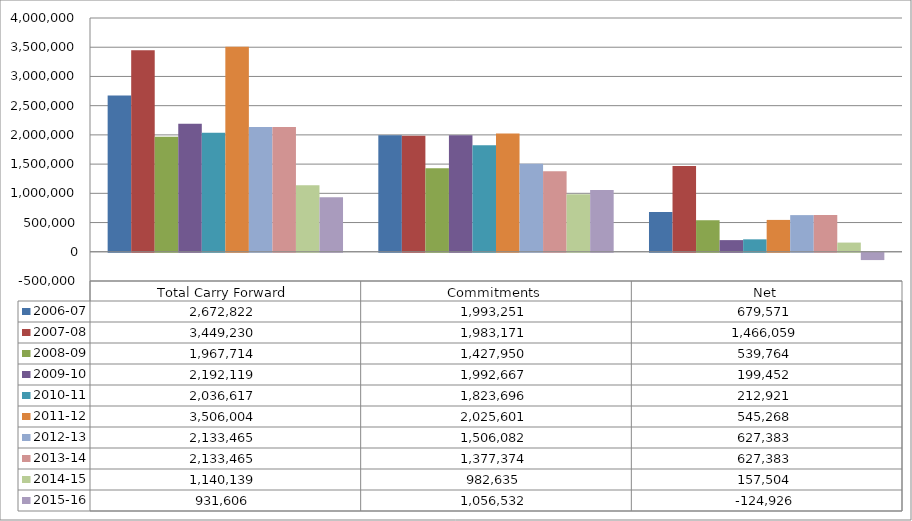
| Category | 2006-07 | 2007-08 | 2008-09 | 2009-10 | 2010-11 | 2011-12 | 2012-13 | 2013-14 | 2014-15 | 2015-16 |
|---|---|---|---|---|---|---|---|---|---|---|
| Total Carry Forward | 2672821.99 | 3449230 | 1967714.35 | 2192119.03 | 2036617 | 3506004 | 2133465 | 2133465 | 1140139.02 | 931606 |
| Commitments | 1993251 | 1983171 | 1427950 | 1992667 | 1823696 | 2025601 | 1506082 | 1377374 | 982635 | 1056532 |
| Net | 679570.99 | 1466059 | 539764.35 | 199452.03 | 212921 | 545268 | 627383 | 627383 | 157504.02 | -124926 |